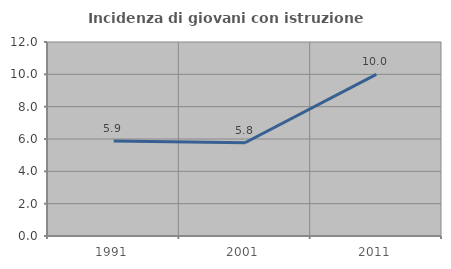
| Category | Incidenza di giovani con istruzione universitaria |
|---|---|
| 1991.0 | 5.882 |
| 2001.0 | 5.769 |
| 2011.0 | 10 |